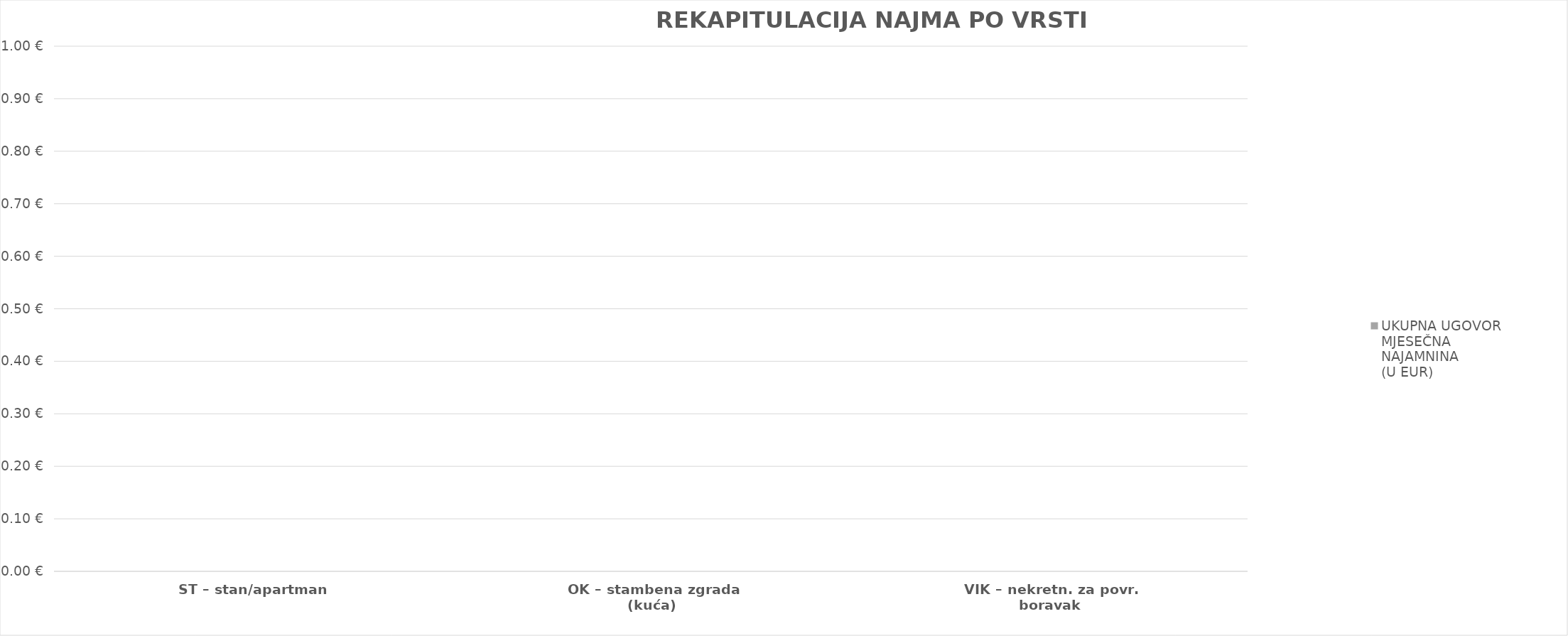
| Category | UKUPNA UGOVORENA MJESEČNA NAJAMNINA 
(U EUR) |
|---|---|
| ST – stan/apartman | 0 |
| OK – stambena zgrada (kuća) | 0 |
| VIK – nekretn. za povr. boravak | 0 |